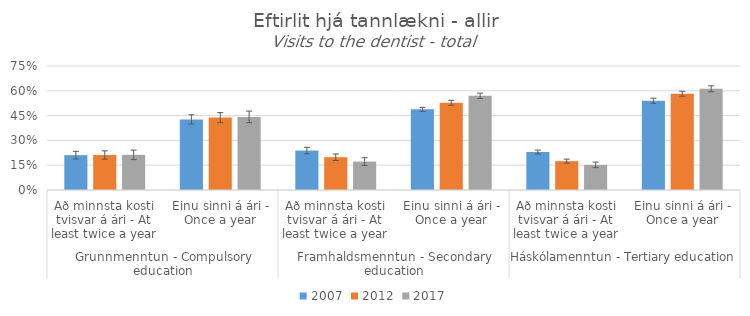
| Category | 2007 | 2012 | 2017 |
|---|---|---|---|
| 0 | 0.211 | 0.212 | 0.213 |
| 1 | 0.427 | 0.438 | 0.442 |
| 2 | 0.239 | 0.198 | 0.172 |
| 3 | 0.488 | 0.527 | 0.57 |
| 4 | 0.23 | 0.175 | 0.152 |
| 5 | 0.539 | 0.582 | 0.612 |